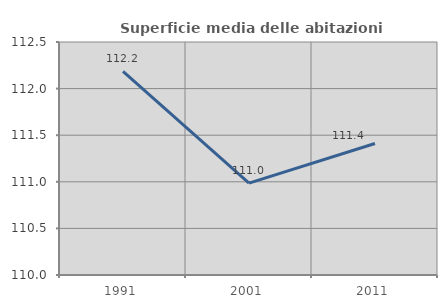
| Category | Superficie media delle abitazioni occupate |
|---|---|
| 1991.0 | 112.184 |
| 2001.0 | 110.985 |
| 2011.0 | 111.411 |